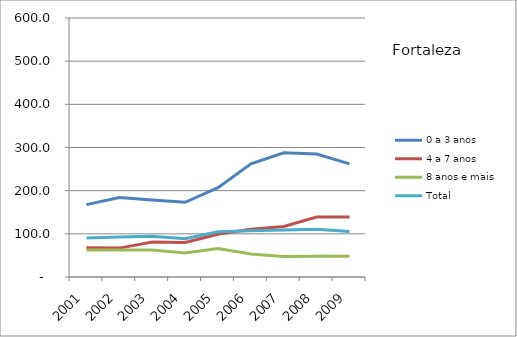
| Category | 0 a 3 anos | 4 a 7 anos | 8 anos e mais | Total |
|---|---|---|---|---|
| 2001.0 | 167.6 | 67.5 | 62.3 | 90.3 |
| 2002.0 | 184.2 | 66.9 | 62.7 | 92.5 |
| 2003.0 | 178.3 | 81.1 | 62.7 | 94.5 |
| 2004.0 | 173 | 80 | 55.8 | 88.5 |
| 2005.0 | 207 | 99.1 | 65.9 | 104.7 |
| 2006.0 | 262.1 | 110.7 | 53.1 | 107.2 |
| 2007.0 | 287.7 | 117.1 | 47.5 | 109 |
| 2008.0 | 284.9 | 138.9 | 47.8 | 110.7 |
| 2009.0 | 262 | 139 | 47.9 | 105.3 |